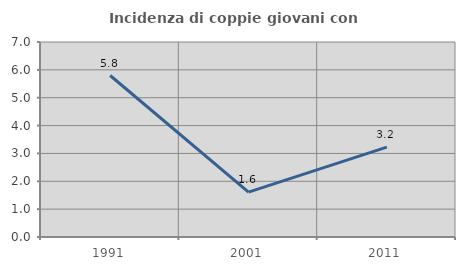
| Category | Incidenza di coppie giovani con figli |
|---|---|
| 1991.0 | 5.797 |
| 2001.0 | 1.613 |
| 2011.0 | 3.226 |